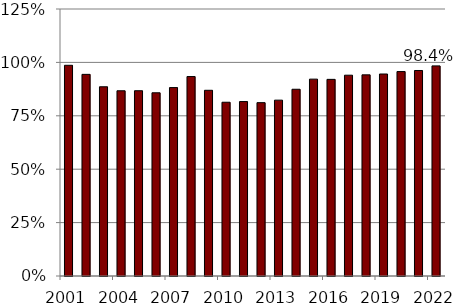
| Category | Series 0 |
|---|---|
| 2001.0 | 0.986 |
| 2002.0 | 0.944 |
| 2003.0 | 0.886 |
| 2004.0 | 0.867 |
| 2005.0 | 0.867 |
| 2006.0 | 0.858 |
| 2007.0 | 0.882 |
| 2008.0 | 0.934 |
| 2009.0 | 0.869 |
| 2010.0 | 0.813 |
| 2011.0 | 0.817 |
| 2012.0 | 0.812 |
| 2013.0 | 0.823 |
| 2014.0 | 0.874 |
| 2015.0 | 0.922 |
| 2016.0 | 0.921 |
| 2017.0 | 0.94 |
| 2018.0 | 0.942 |
| 2019.0 | 0.946 |
| 2020.0 | 0.957 |
| 2021.0 | 0.962 |
| 2022.0 | 0.984 |